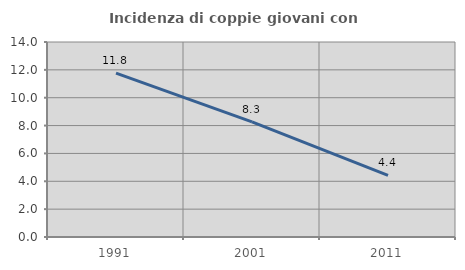
| Category | Incidenza di coppie giovani con figli |
|---|---|
| 1991.0 | 11.765 |
| 2001.0 | 8.261 |
| 2011.0 | 4.417 |